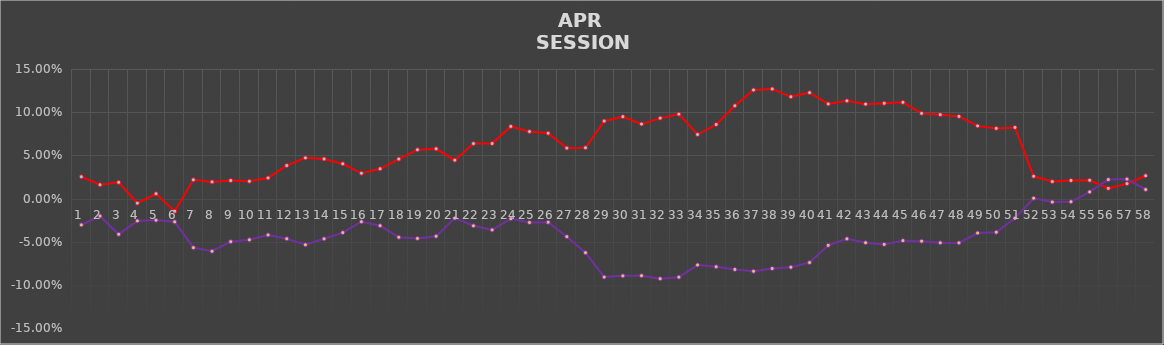
| Category | Series 0 | Series 1 |
|---|---|---|
| 0 | 0.025 | -0.031 |
| 1 | 0.016 | -0.02 |
| 2 | 0.019 | -0.042 |
| 3 | -0.005 | -0.026 |
| 4 | 0.006 | -0.025 |
| 5 | -0.015 | -0.027 |
| 6 | 0.022 | -0.057 |
| 7 | 0.019 | -0.061 |
| 8 | 0.021 | -0.05 |
| 9 | 0.02 | -0.048 |
| 10 | 0.024 | -0.042 |
| 11 | 0.038 | -0.047 |
| 12 | 0.047 | -0.054 |
| 13 | 0.046 | -0.047 |
| 14 | 0.04 | -0.04 |
| 15 | 0.029 | -0.027 |
| 16 | 0.034 | -0.032 |
| 17 | 0.046 | -0.045 |
| 18 | 0.056 | -0.046 |
| 19 | 0.058 | -0.044 |
| 20 | 0.044 | -0.023 |
| 21 | 0.064 | -0.032 |
| 22 | 0.064 | -0.036 |
| 23 | 0.084 | -0.023 |
| 24 | 0.078 | -0.028 |
| 25 | 0.076 | -0.028 |
| 26 | 0.058 | -0.044 |
| 27 | 0.059 | -0.063 |
| 28 | 0.09 | -0.091 |
| 29 | 0.095 | -0.09 |
| 30 | 0.086 | -0.089 |
| 31 | 0.093 | -0.093 |
| 32 | 0.098 | -0.091 |
| 33 | 0.074 | -0.077 |
| 34 | 0.086 | -0.079 |
| 35 | 0.107 | -0.082 |
| 36 | 0.126 | -0.084 |
| 37 | 0.127 | -0.081 |
| 38 | 0.118 | -0.08 |
| 39 | 0.123 | -0.074 |
| 40 | 0.11 | -0.054 |
| 41 | 0.113 | -0.047 |
| 42 | 0.109 | -0.051 |
| 43 | 0.11 | -0.053 |
| 44 | 0.111 | -0.049 |
| 45 | 0.099 | -0.05 |
| 46 | 0.097 | -0.051 |
| 47 | 0.095 | -0.051 |
| 48 | 0.084 | -0.04 |
| 49 | 0.081 | -0.039 |
| 50 | 0.082 | -0.023 |
| 51 | 0.026 | 0 |
| 52 | 0.02 | -0.004 |
| 53 | 0.021 | -0.004 |
| 54 | 0.021 | 0.008 |
| 55 | 0.012 | 0.022 |
| 56 | 0.017 | 0.022 |
| 57 | 0.026 | 0.01 |